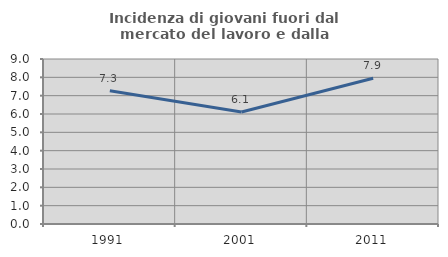
| Category | Incidenza di giovani fuori dal mercato del lavoro e dalla formazione  |
|---|---|
| 1991.0 | 7.267 |
| 2001.0 | 6.109 |
| 2011.0 | 7.95 |